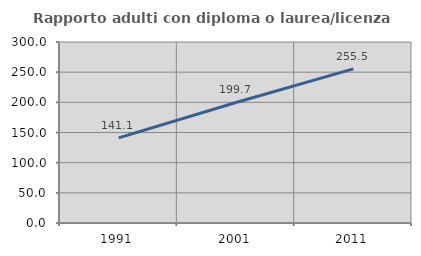
| Category | Rapporto adulti con diploma o laurea/licenza media  |
|---|---|
| 1991.0 | 141.145 |
| 2001.0 | 199.746 |
| 2011.0 | 255.5 |